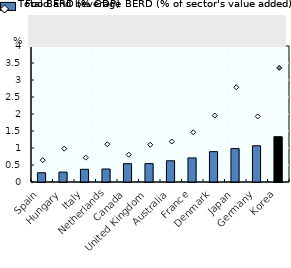
| Category | Food and beverage BERD as % of sector's value added |
|---|---|
| Spain | 0.272 |
| Hungary | 0.291 |
| Italy | 0.373 |
| Netherlands | 0.382 |
| Canada | 0.539 |
| United Kingdom | 0.542 |
| Australia | 0.625 |
| France | 0.708 |
| Denmark | 0.893 |
| Japan | 0.984 |
| Germany | 1.065 |
| Korea | 1.332 |